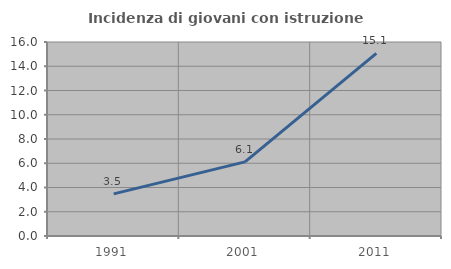
| Category | Incidenza di giovani con istruzione universitaria |
|---|---|
| 1991.0 | 3.476 |
| 2001.0 | 6.11 |
| 2011.0 | 15.059 |